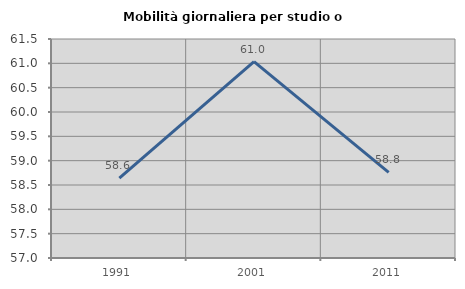
| Category | Mobilità giornaliera per studio o lavoro |
|---|---|
| 1991.0 | 58.642 |
| 2001.0 | 61.035 |
| 2011.0 | 58.761 |